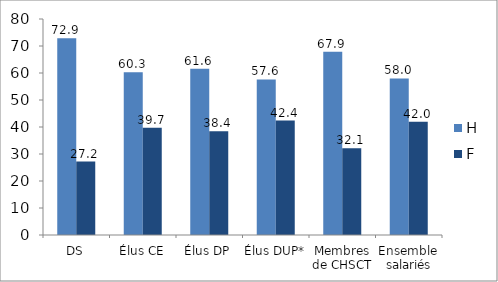
| Category | H | F |
|---|---|---|
| DS | 72.9 | 27.2 |
| Élus CE | 60.3 | 39.7 |
| Élus DP | 61.6 | 38.4 |
| Élus DUP*  | 57.6 | 42.4 |
| Membres de CHSCT | 67.9 | 32.1 |
| Ensemble  salariés | 58 | 41.96 |